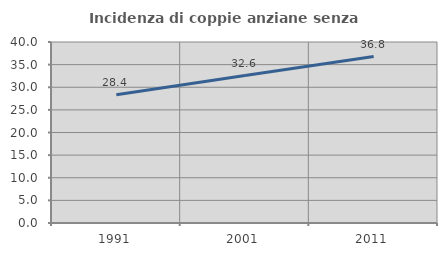
| Category | Incidenza di coppie anziane senza figli  |
|---|---|
| 1991.0 | 28.364 |
| 2001.0 | 32.589 |
| 2011.0 | 36.788 |